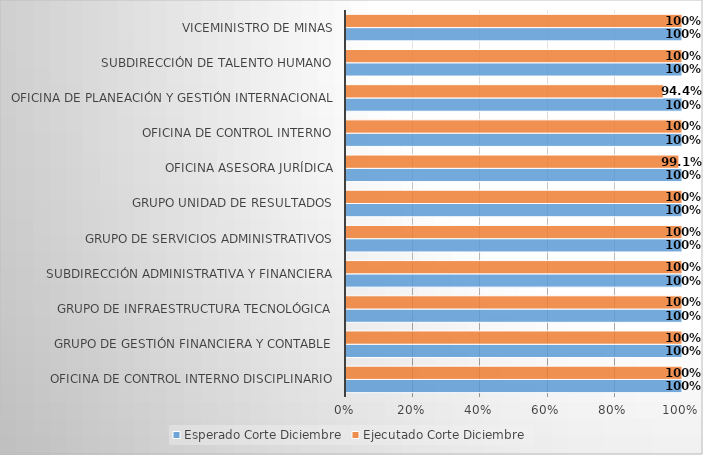
| Category | Esperado Corte Diciembre | Ejecutado Corte Diciembre |
|---|---|---|
| OFICINA DE CONTROL INTERNO DISCIPLINARIO | 1 | 1 |
| GRUPO DE GESTIÓN FINANCIERA Y CONTABLE | 1 | 1 |
| GRUPO DE INFRAESTRUCTURA TECNOLÓGICA | 1 | 1 |
| SUBDIRECCIÓN ADMINISTRATIVA Y FINANCIERA | 1 | 1 |
| GRUPO DE SERVICIOS ADMINISTRATIVOS | 1 | 1 |
| GRUPO UNIDAD DE RESULTADOS | 1 | 1 |
| OFICINA ASESORA JURÍDICA | 1 | 0.991 |
| OFICINA DE CONTROL INTERNO | 1 | 1 |
| OFICINA DE PLANEACIÓN Y GESTIÓN INTERNACIONAL | 1 | 0.944 |
| SUBDIRECCIÓN DE TALENTO HUMANO | 1 | 1 |
| VICEMINISTRO DE MINAS | 1 | 1 |